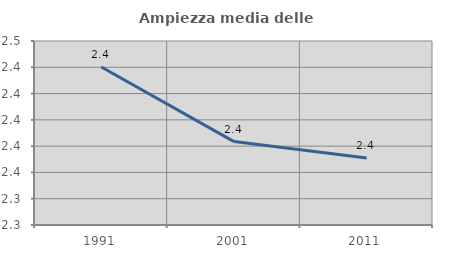
| Category | Ampiezza media delle famiglie |
|---|---|
| 1991.0 | 2.44 |
| 2001.0 | 2.383 |
| 2011.0 | 2.371 |